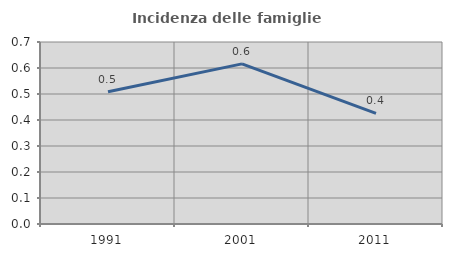
| Category | Incidenza delle famiglie numerose |
|---|---|
| 1991.0 | 0.508 |
| 2001.0 | 0.616 |
| 2011.0 | 0.425 |